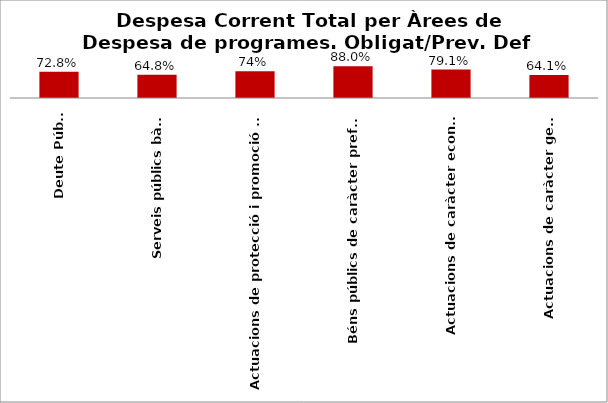
| Category | Series 0 |
|---|---|
| Deute Públic | 0.728 |
| Serveis públics bàsics | 0.648 |
| Actuacions de protecció i promoció social | 0.743 |
| Béns públics de caràcter preferent | 0.88 |
| Actuacions de caràcter econòmic | 0.791 |
| Actuacions de caràcter general | 0.641 |